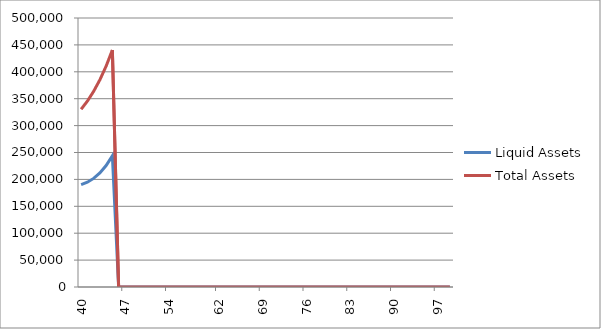
| Category | Liquid Assets | Total Assets |
|---|---|---|
| 40.0 | 190394.015 | 330394.015 |
| 41.0 | 194713.817 | 345458.138 |
| 42.0 | 201849.631 | 363628.046 |
| 43.0 | 211961.417 | 385072.489 |
| 44.0 | 225799.677 | 410551.056 |
| 45.0 | 243786.583 | 440495.313 |
| 46.0 | 0 | 0 |
| 47.0 | 0 | 0 |
| 48.0 | 0 | 0 |
| 49.0 | 0 | 0 |
| 50.0 | 0 | 0 |
| 51.0 | 0 | 0 |
| 52.0 | 0 | 0 |
| 53.0 | 0 | 0 |
| 54.0 | 0 | 0 |
| 55.0 | 0 | 0 |
| 56.0 | 0 | 0 |
| 57.0 | 0 | 0 |
| 58.0 | 0 | 0 |
| 59.0 | 0 | 0 |
| 60.0 | 0 | 0 |
| 61.0 | 0 | 0 |
| 62.0 | 0 | 0 |
| 63.0 | 0 | 0 |
| 64.0 | 0 | 0 |
| 65.0 | 0 | 0 |
| 66.0 | 0 | 0 |
| 67.0 | 0 | 0 |
| 68.0 | 0 | 0 |
| 69.0 | 0 | 0 |
| 70.0 | 0 | 0 |
| 71.0 | 0 | 0 |
| 72.0 | 0 | 0 |
| 73.0 | 0 | 0 |
| 74.0 | 0 | 0 |
| 75.0 | 0 | 0 |
| 76.0 | 0 | 0 |
| 77.0 | 0 | 0 |
| 78.0 | 0 | 0 |
| 79.0 | 0 | 0 |
| 80.0 | 0 | 0 |
| 81.0 | 0 | 0 |
| 82.0 | 0 | 0 |
| 83.0 | 0 | 0 |
| 84.0 | 0 | 0 |
| 85.0 | 0 | 0 |
| 86.0 | 0 | 0 |
| 87.0 | 0 | 0 |
| 88.0 | 0 | 0 |
| 89.0 | 0 | 0 |
| 90.0 | 0 | 0 |
| 91.0 | 0 | 0 |
| 92.0 | 0 | 0 |
| 93.0 | 0 | 0 |
| 94.0 | 0 | 0 |
| 95.0 | 0 | 0 |
| 96.0 | 0 | 0 |
| 97.0 | 0 | 0 |
| 98.0 | 0 | 0 |
| 99.0 | 0 | 0 |